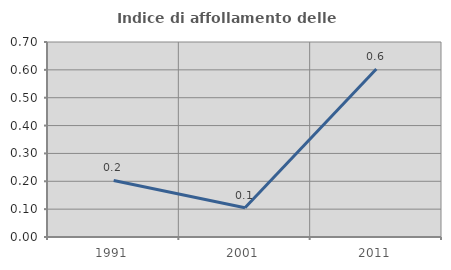
| Category | Indice di affollamento delle abitazioni  |
|---|---|
| 1991.0 | 0.203 |
| 2001.0 | 0.105 |
| 2011.0 | 0.603 |